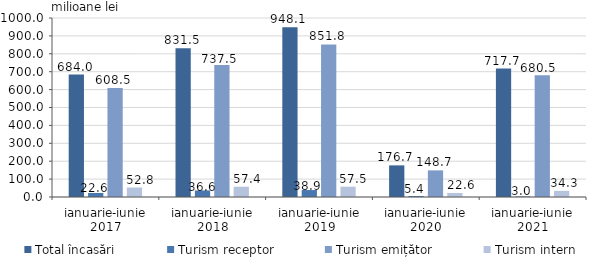
| Category | Total încasări | Turism receptor | Turism emițător | Turism intern |
|---|---|---|---|---|
| ianuarie-iunie 2017 | 684 | 22.6 | 608.5 | 52.8 |
| ianuarie-iunie 2018 | 831.5 | 36.6 | 737.5 | 57.4 |
| ianuarie-iunie 2019 | 948.1 | 38.9 | 851.8 | 57.5 |
| ianuarie-iunie 2020 | 176.7 | 5.4 | 148.7 | 22.6 |
| ianuarie-iunie 2021 | 717.7 | 3 | 680.5 | 34.3 |